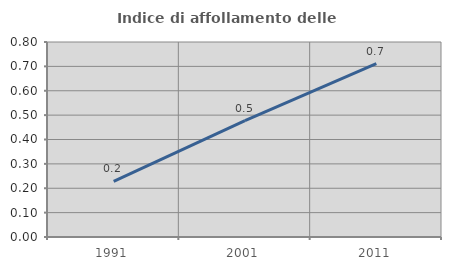
| Category | Indice di affollamento delle abitazioni  |
|---|---|
| 1991.0 | 0.228 |
| 2001.0 | 0.478 |
| 2011.0 | 0.711 |